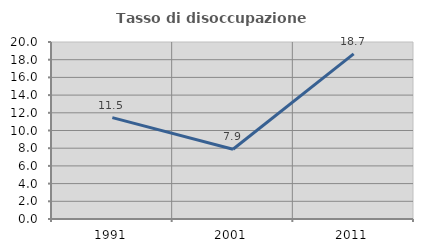
| Category | Tasso di disoccupazione giovanile  |
|---|---|
| 1991.0 | 11.452 |
| 2001.0 | 7.884 |
| 2011.0 | 18.654 |